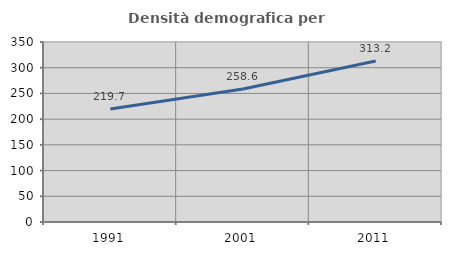
| Category | Densità demografica |
|---|---|
| 1991.0 | 219.723 |
| 2001.0 | 258.632 |
| 2011.0 | 313.153 |